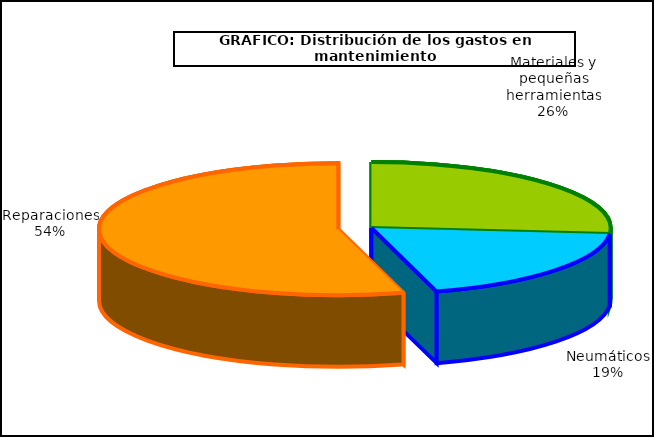
| Category | Series 0 |
|---|---|
| 0 | 381.986 |
| 1 | 277.597 |
| 2 | 786.728 |